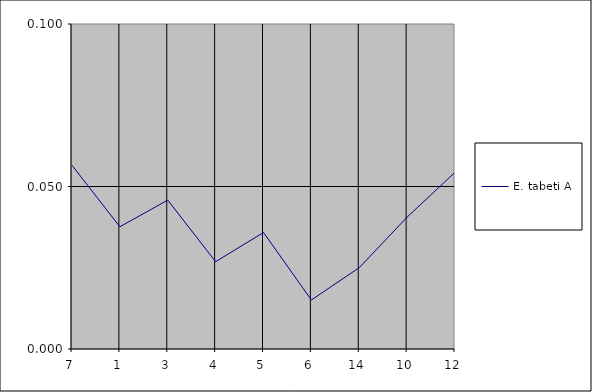
| Category | E. tabeti A |
|---|---|
| 7.0 | 0.057 |
| 1.0 | 0.038 |
| 3.0 | 0.046 |
| 4.0 | 0.027 |
| 5.0 | 0.036 |
| 6.0 | 0.015 |
| 14.0 | 0.025 |
| 10.0 | 0.041 |
| 12.0 | 0.054 |